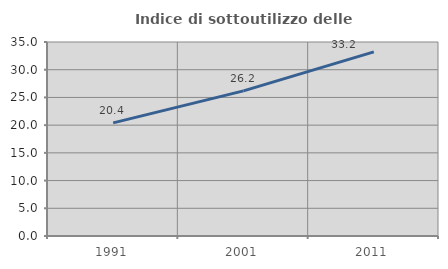
| Category | Indice di sottoutilizzo delle abitazioni  |
|---|---|
| 1991.0 | 20.415 |
| 2001.0 | 26.187 |
| 2011.0 | 33.208 |